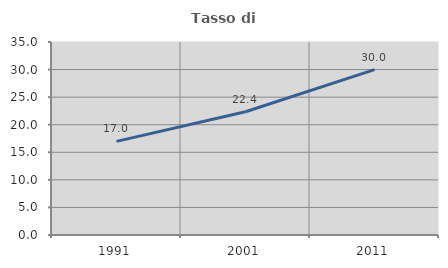
| Category | Tasso di occupazione   |
|---|---|
| 1991.0 | 16.975 |
| 2001.0 | 22.36 |
| 2011.0 | 29.997 |